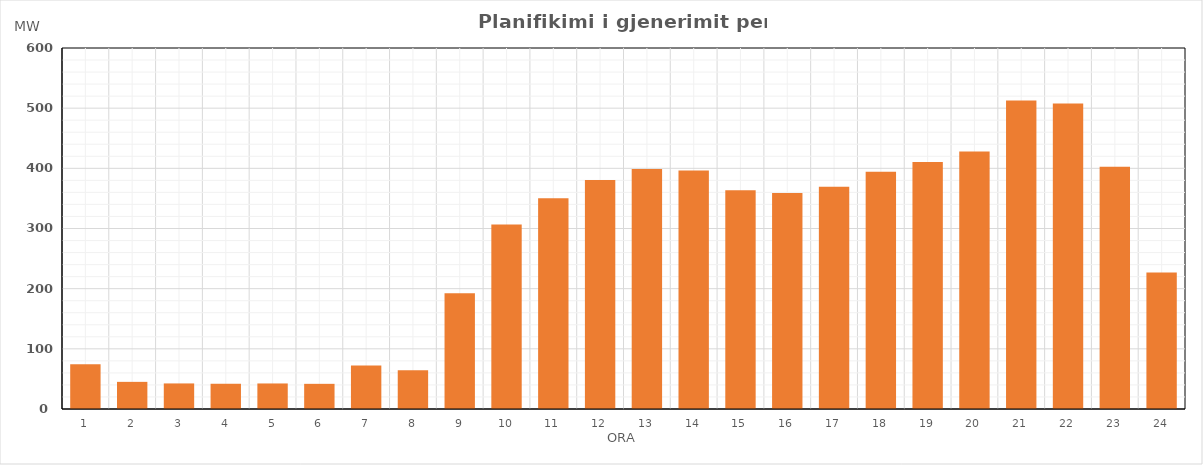
| Category | Max (MW) |
|---|---|
| 0 | 74.447 |
| 1 | 45.105 |
| 2 | 42.494 |
| 3 | 41.952 |
| 4 | 42.45 |
| 5 | 41.83 |
| 6 | 72.457 |
| 7 | 64.362 |
| 8 | 192.461 |
| 9 | 306.834 |
| 10 | 350.222 |
| 11 | 380.439 |
| 12 | 399.004 |
| 13 | 396.398 |
| 14 | 363.741 |
| 15 | 359.133 |
| 16 | 369.408 |
| 17 | 394.159 |
| 18 | 410.566 |
| 19 | 428.068 |
| 20 | 512.684 |
| 21 | 507.656 |
| 22 | 402.713 |
| 23 | 226.701 |